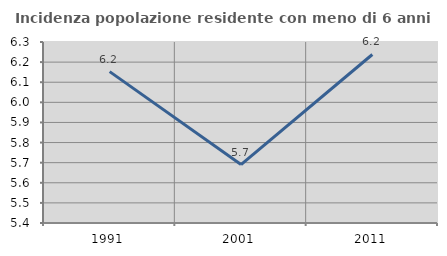
| Category | Incidenza popolazione residente con meno di 6 anni |
|---|---|
| 1991.0 | 6.153 |
| 2001.0 | 5.691 |
| 2011.0 | 6.238 |